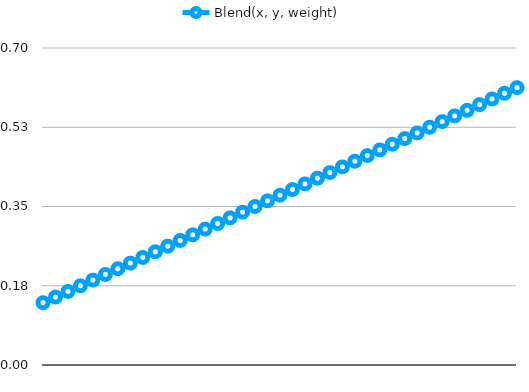
| Category | Blend(x, y, weight) |
|---|---|
|  | 0.138 |
|  | 0.15 |
|  | 0.162 |
|  | 0.175 |
|  | 0.188 |
|  | 0.2 |
|  | 0.212 |
|  | 0.225 |
|  | 0.238 |
|  | 0.25 |
|  | 0.262 |
|  | 0.275 |
|  | 0.288 |
|  | 0.3 |
|  | 0.312 |
|  | 0.325 |
|  | 0.338 |
|  | 0.35 |
|  | 0.362 |
|  | 0.375 |
|  | 0.388 |
|  | 0.4 |
|  | 0.412 |
|  | 0.425 |
|  | 0.438 |
|  | 0.45 |
|  | 0.462 |
|  | 0.475 |
|  | 0.488 |
|  | 0.5 |
|  | 0.512 |
|  | 0.525 |
|  | 0.538 |
|  | 0.55 |
|  | 0.562 |
|  | 0.575 |
|  | 0.588 |
|  | 0.6 |
|  | 0.612 |